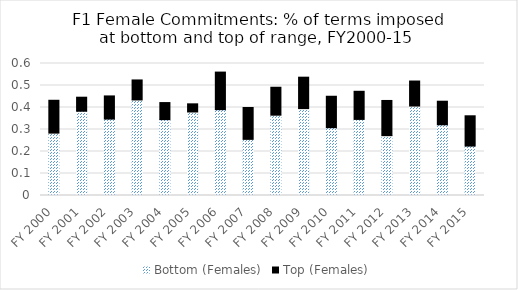
| Category | Bottom (Females) | Top (Females) |
|---|---|---|
| FY 2000 | 0.284 | 0.149 |
| FY 2001 | 0.383 | 0.064 |
| FY 2002 | 0.347 | 0.105 |
| FY 2003 | 0.434 | 0.091 |
| FY 2004 | 0.345 | 0.078 |
| FY 2005 | 0.38 | 0.037 |
| FY 2006 | 0.39 | 0.171 |
| FY 2007 | 0.255 | 0.145 |
| FY 2008 | 0.365 | 0.127 |
| FY 2009 | 0.395 | 0.143 |
| FY 2010 | 0.308 | 0.143 |
| FY 2011 | 0.346 | 0.128 |
| FY 2012 | 0.272 | 0.16 |
| FY 2013 | 0.407 | 0.114 |
| FY 2014 | 0.321 | 0.107 |
| FY 2015 | 0.225 | 0.138 |